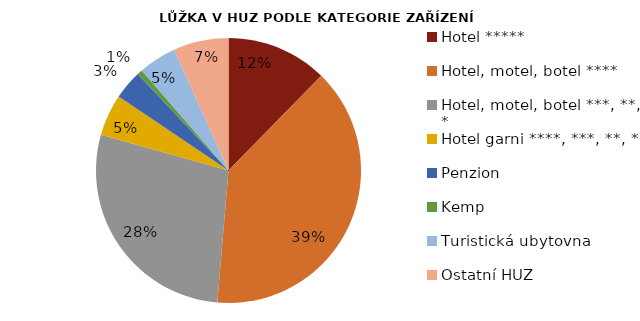
| Category | Series 0 |
|---|---|
| Hotel ***** | 12599 |
| Hotel, motel, botel **** | 39835 |
| Hotel, motel, botel ***, **, * | 28594 |
| Hotel garni ****, ***, **, * | 5208 |
| Penzion | 3621 |
| Kemp | 654 |
| Turistická ubytovna | 4733 |
| Ostatní HUZ | 6874 |